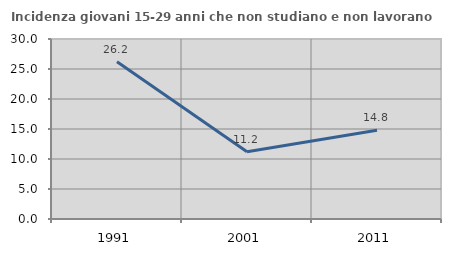
| Category | Incidenza giovani 15-29 anni che non studiano e non lavorano  |
|---|---|
| 1991.0 | 26.19 |
| 2001.0 | 11.22 |
| 2011.0 | 14.796 |